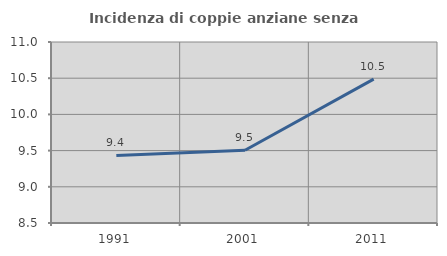
| Category | Incidenza di coppie anziane senza figli  |
|---|---|
| 1991.0 | 9.434 |
| 2001.0 | 9.504 |
| 2011.0 | 10.487 |